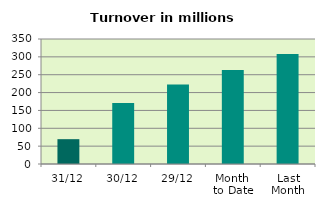
| Category | Series 0 |
|---|---|
| 31/12 | 69.504 |
| 30/12 | 170.968 |
| 29/12 | 222.655 |
| Month 
to Date | 263.133 |
| Last
Month | 307.664 |